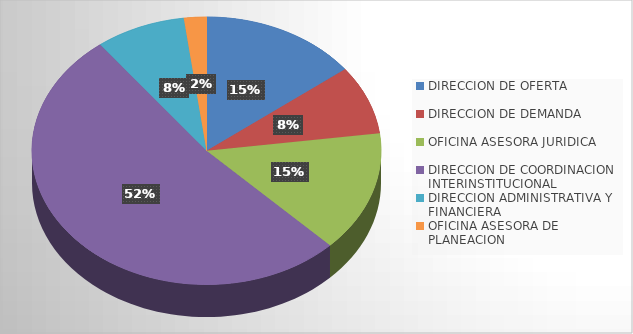
| Category | Series 0 |
|---|---|
| DIRECCION DE OFERTA | 7 |
| DIRECCION DE DEMANDA | 4 |
| OFICINA ASESORA JURIDICA | 7 |
| DIRECCION DE COORDINACION INTERINSTITUCIONAL | 25 |
| DIRECCION ADMINISTRATIVA Y FINANCIERA | 4 |
| OFICINA ASESORA DE PLANEACION | 1 |